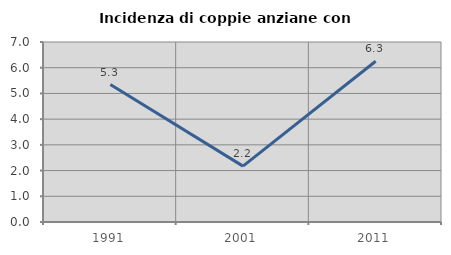
| Category | Incidenza di coppie anziane con figli |
|---|---|
| 1991.0 | 5.344 |
| 2001.0 | 2.174 |
| 2011.0 | 6.25 |